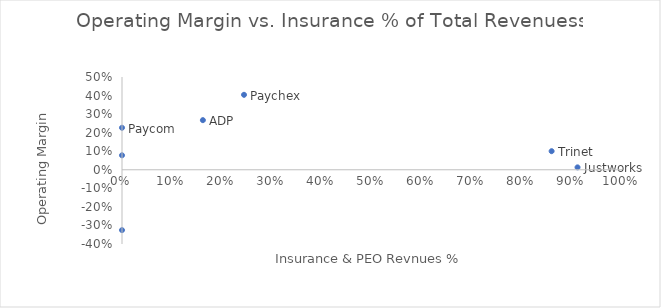
| Category | Series 0 |
|---|---|
| 0.1617526192737051 | 0.267 |
| 0.2440272288098375 | 0.404 |
| 0.8592511013215859 | 0.1 |
| 0.0 | 0.226 |
| 0.9110613615548998 | 0.013 |
| 0.0 | 0.078 |
| 0.0 | -0.325 |